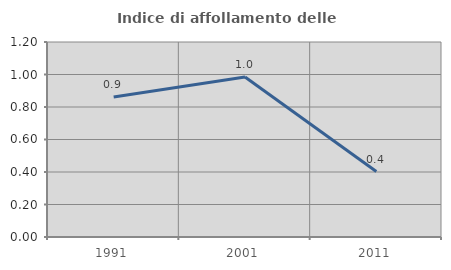
| Category | Indice di affollamento delle abitazioni  |
|---|---|
| 1991.0 | 0.862 |
| 2001.0 | 0.985 |
| 2011.0 | 0.403 |